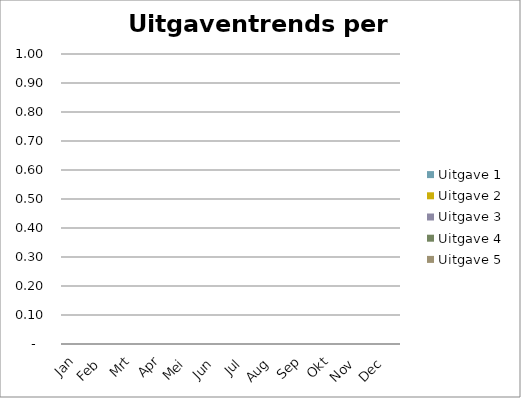
| Category | Uitgave 1 | Uitgave 2 | Uitgave 3 | Uitgave 4 | Uitgave 5 |
|---|---|---|---|---|---|
| Jan | 0 | 0 | 0 | 0 | 0 |
| Feb | 0 | 0 | 0 | 0 | 0 |
| Mrt | 0 | 0 | 0 | 0 | 0 |
| Apr | 0 | 0 | 0 | 0 | 0 |
| Mei | 0 | 0 | 0 | 0 | 0 |
| Jun | 0 | 0 | 0 | 0 | 0 |
| Jul | 0 | 0 | 0 | 0 | 0 |
| Aug | 0 | 0 | 0 | 0 | 0 |
| Sep | 0 | 0 | 0 | 0 | 0 |
| Okt | 0 | 0 | 0 | 0 | 0 |
| Nov | 0 | 0 | 0 | 0 | 0 |
| Dec | 0 | 0 | 0 | 0 | 0 |